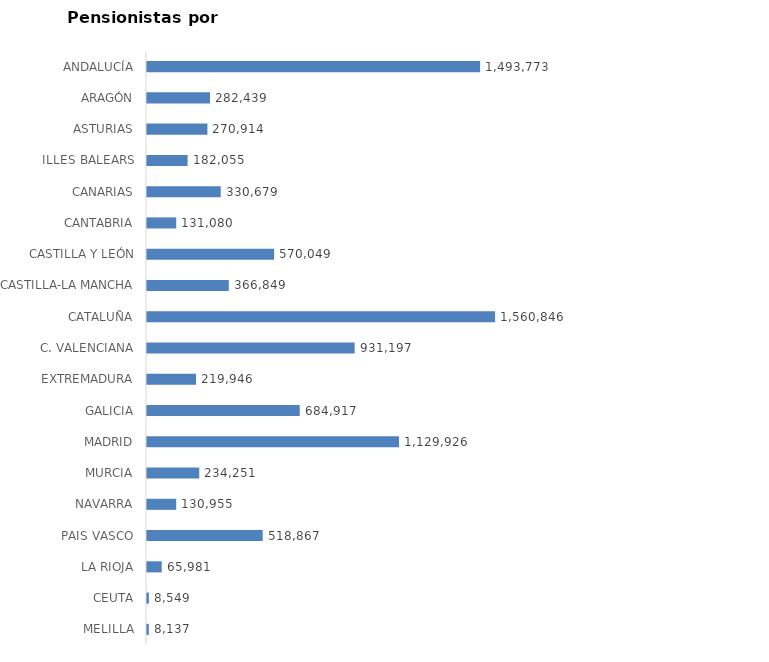
| Category | AMBOS SEXOS (1) |
|---|---|
| ANDALUCÍA | 1493773 |
| ARAGÓN | 282439 |
| ASTURIAS | 270914 |
| ILLES BALEARS | 182055 |
| CANARIAS | 330679 |
| CANTABRIA | 131080 |
| CASTILLA Y LEÓN | 570049 |
| CASTILLA-LA MANCHA | 366849 |
| CATALUÑA | 1560846 |
| C. VALENCIANA | 931197 |
| EXTREMADURA | 219946 |
| GALICIA | 684917 |
| MADRID | 1129926 |
| MURCIA | 234251 |
| NAVARRA | 130955 |
| PAIS VASCO | 518867 |
| LA RIOJA | 65981 |
| CEUTA | 8549 |
| MELILLA | 8137 |